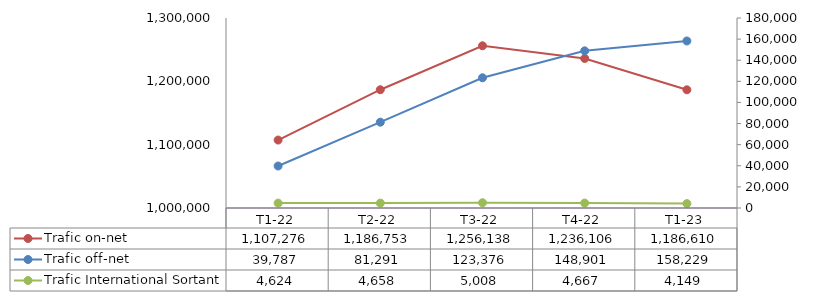
| Category | Trafic on-net |
|---|---|
| T1-22 | 1107275.737 |
| T2-22 | 1186752.513 |
| T3-22 | 1256137.727 |
| T4-22 | 1236106.01 |
| T1-23 | 1186609.846 |